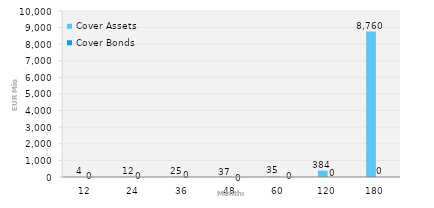
| Category | Cover Assets | Cover Bonds |
|---|---|---|
| 12.0 | 4.375 | 0 |
| 24.0 | 12.362 | 0 |
| 36.0 | 25.028 | 0 |
| 48.0 | 37.356 | 0 |
| 60.0 | 35.153 | 0 |
| 120.0 | 384.435 | 0 |
| 180.0 | 8759.934 | 0 |